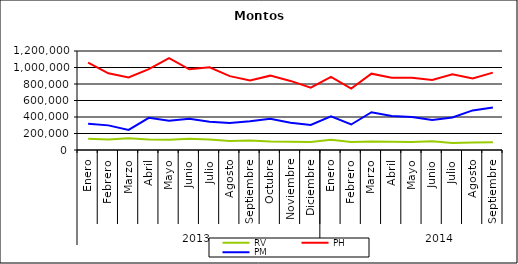
| Category | RV | PH | PM |
|---|---|---|---|
| 0 | 136808.804 | 1058774.967 | 316751.291 |
| 1 | 127193.421 | 930111.334 | 298480.292 |
| 2 | 142052.509 | 880100.908 | 242691.68 |
| 3 | 126637.277 | 980038.371 | 389833.89 |
| 4 | 123189.846 | 1112542.201 | 355777.139 |
| 5 | 135184.022 | 977877.296 | 379782.022 |
| 6 | 127790.361 | 1003315.643 | 342842.568 |
| 7 | 110532.346 | 895717.973 | 326616.455 |
| 8 | 114630.859 | 843607.598 | 348985.725 |
| 9 | 102262.08 | 901170.281 | 379642.157 |
| 10 | 99242.352 | 837424.505 | 330278.777 |
| 11 | 96243.301 | 754952.55 | 304473.582 |
| 12 | 124770.971 | 885857.327 | 408057.686 |
| 13 | 96987.292 | 744736.746 | 309218.036 |
| 14 | 103624.997 | 925209.281 | 458118.752 |
| 15 | 100007.683 | 874534.649 | 410841.727 |
| 16 | 96199.147 | 875356.86 | 399197.561 |
| 17 | 104965.63 | 848001.408 | 363776.247 |
| 18 | 85979.134 | 918529.646 | 394798.235 |
| 19 | 91006.222 | 867037.612 | 479726.319 |
| 20 | 95061.186 | 938312.305 | 516086.875 |